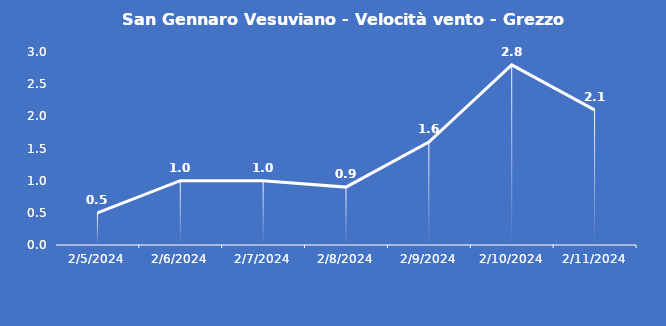
| Category | San Gennaro Vesuviano - Velocità vento - Grezzo (m/s) |
|---|---|
| 2/5/24 | 0.5 |
| 2/6/24 | 1 |
| 2/7/24 | 1 |
| 2/8/24 | 0.9 |
| 2/9/24 | 1.6 |
| 2/10/24 | 2.8 |
| 2/11/24 | 2.1 |